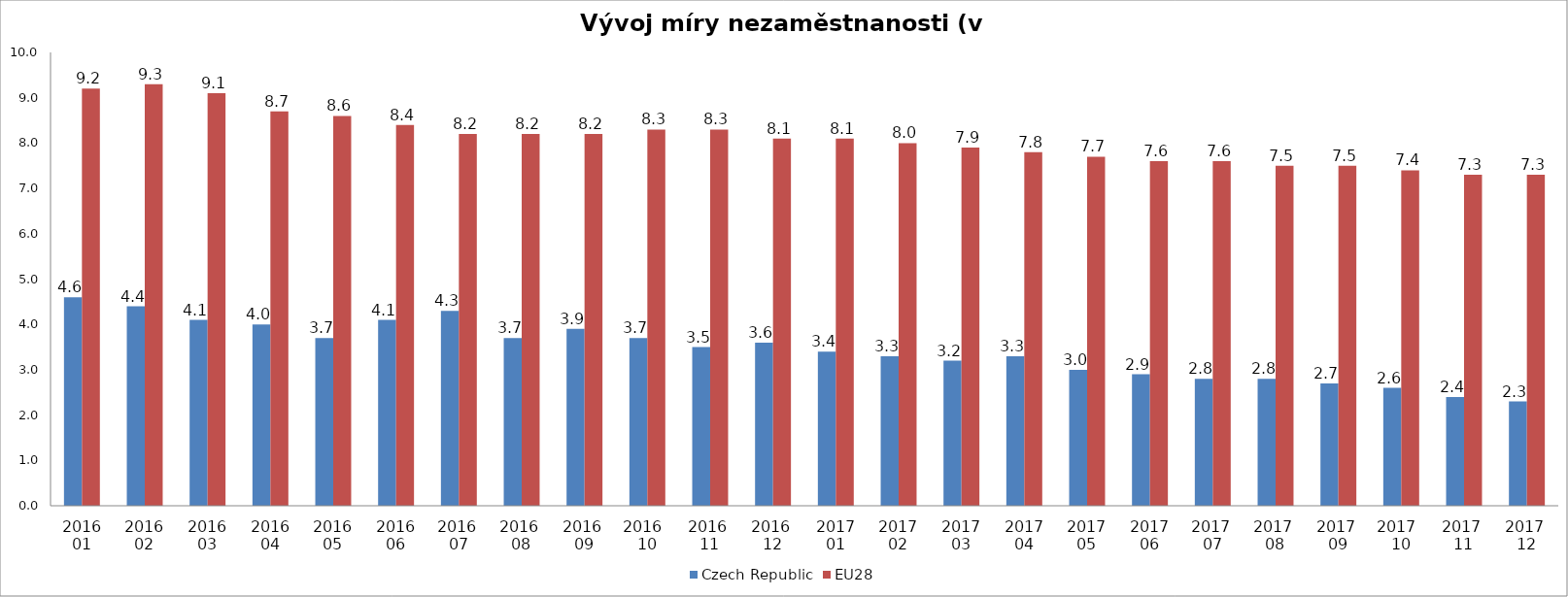
| Category | Czech Republic | EU28 |
|---|---|---|
| 2016 01 | 4.6 | 9.2 |
| 2016 02 | 4.4 | 9.3 |
| 2016 03 | 4.1 | 9.1 |
| 2016 04 | 4 | 8.7 |
| 2016 05 | 3.7 | 8.6 |
| 2016 06 | 4.1 | 8.4 |
| 2016  07 | 4.3 | 8.2 |
| 2016  08 | 3.7 | 8.2 |
| 2016  09 | 3.9 | 8.2 |
| 2016   10 | 3.7 | 8.3 |
| 2016  11 | 3.5 | 8.3 |
| 2016  12 | 3.6 | 8.1 |
| 2017 01 | 3.4 | 8.1 |
| 2017 02 | 3.3 | 8 |
| 2017 03 | 3.2 | 7.9 |
| 2017 04 | 3.3 | 7.8 |
| 2017 05 | 3 | 7.7 |
| 2017 06 | 2.9 | 7.6 |
| 2017  07 | 2.8 | 7.6 |
| 2017  08 | 2.8 | 7.5 |
| 2017  09 | 2.7 | 7.5 |
| 2017   10 | 2.6 | 7.4 |
| 2017  11 | 2.4 | 7.3 |
| 2017  12 | 2.3 | 7.3 |